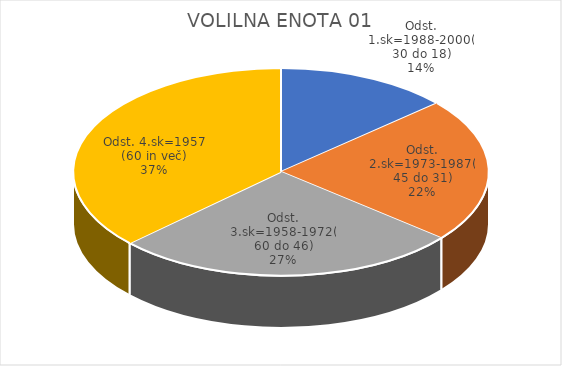
| Category | VOLILNA ENOTA 01 |
|---|---|
| Odst. 1.sk=1988-2000(30 do 18) | 7.41 |
| Odst. 2.sk=1973-1987(45 do 31) | 12.34 |
| Odst. 3.sk=1958-1972(60 do 46) | 14.78 |
| Odst. 4.sk=1957 (60 in več) | 20.32 |